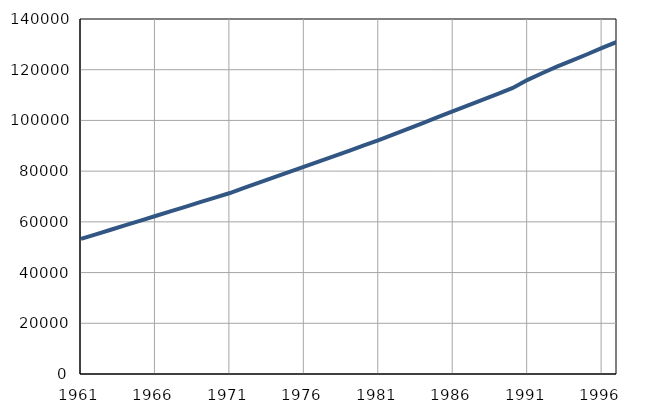
| Category | Population
size |
|---|---|
| 1961.0 | 53270 |
| 1962.0 | 55080 |
| 1963.0 | 56890 |
| 1964.0 | 58700 |
| 1965.0 | 60510 |
| 1966.0 | 62320 |
| 1967.0 | 64130 |
| 1968.0 | 65940 |
| 1969.0 | 67750 |
| 1970.0 | 69560 |
| 1971.0 | 71374 |
| 1972.0 | 73457 |
| 1973.0 | 75540 |
| 1974.0 | 77623 |
| 1975.0 | 79706 |
| 1976.0 | 81789 |
| 1977.0 | 83872 |
| 1978.0 | 85955 |
| 1979.0 | 88038 |
| 1980.0 | 90121 |
| 1981.0 | 92203 |
| 1982.0 | 94492 |
| 1983.0 | 96781 |
| 1984.0 | 99070 |
| 1985.0 | 101359 |
| 1986.0 | 103648 |
| 1987.0 | 105937 |
| 1988.0 | 108226 |
| 1989.0 | 110515 |
| 1990.0 | 112804 |
| 1991.0 | 116000 |
| 1992.0 | 118700 |
| 1993.0 | 121300 |
| 1994.0 | 123700 |
| 1995.0 | 126100 |
| 1996.0 | 128600 |
| 1997.0 | 131000 |